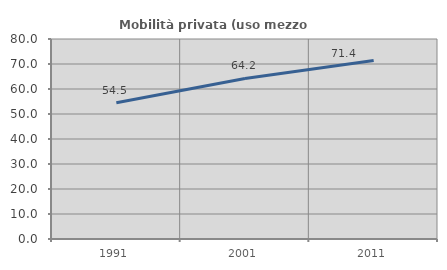
| Category | Mobilità privata (uso mezzo privato) |
|---|---|
| 1991.0 | 54.476 |
| 2001.0 | 64.235 |
| 2011.0 | 71.429 |